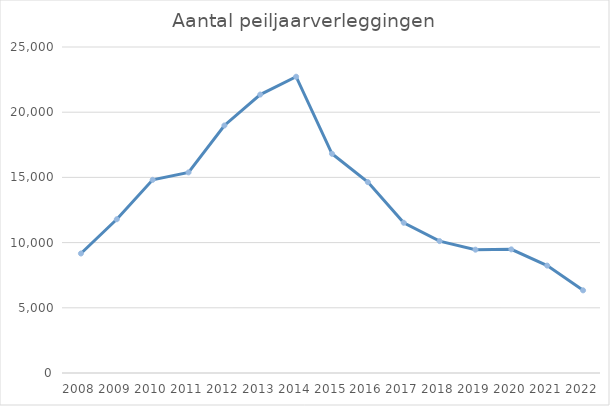
| Category | Aantal peiljaar- verleggingen |
|---|---|
| 2008.0 | 9165 |
| 2009.0 | 11791 |
| 2010.0 | 14814 |
| 2011.0 | 15384 |
| 2012.0 | 18982 |
| 2013.0 | 21353 |
| 2014.0 | 22720 |
| 2015.0 | 16812 |
| 2016.0 | 14638 |
| 2017.0 | 11522 |
| 2018.0 | 10115 |
| 2019.0 | 9458 |
| 2020.0 | 9481 |
| 2021.0 | 8236 |
| 2022.0 | 6338 |